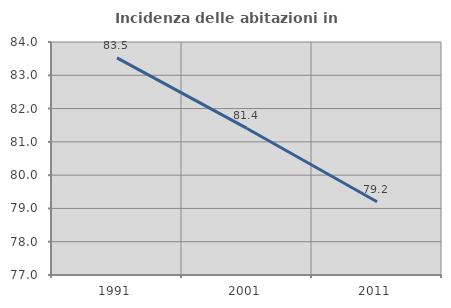
| Category | Incidenza delle abitazioni in proprietà  |
|---|---|
| 1991.0 | 83.524 |
| 2001.0 | 81.403 |
| 2011.0 | 79.2 |